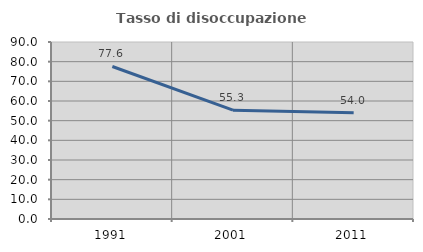
| Category | Tasso di disoccupazione giovanile  |
|---|---|
| 1991.0 | 77.554 |
| 2001.0 | 55.325 |
| 2011.0 | 53.965 |